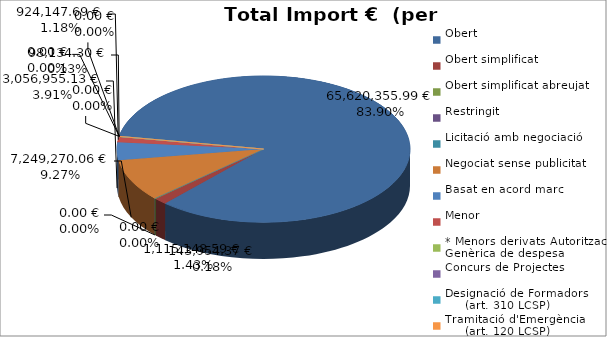
| Category | Total preu
(amb IVA) |
|---|---|
| Obert | 65620355.99 |
| Obert simplificat | 1115148.59 |
| Obert simplificat abreujat | 143954.37 |
| Restringit | 0 |
| Licitació amb negociació | 0 |
| Negociat sense publicitat | 7249270.06 |
| Basat en acord marc | 3056955.13 |
| Menor | 924147.69 |
| * Menors derivats Autorització Genèrica de despesa | 98134.3 |
| Concurs de Projectes | 0 |
| Designació de Formadors
     (art. 310 LCSP) | 0 |
| Tramitació d'Emergència
     (art. 120 LCSP) | 0 |